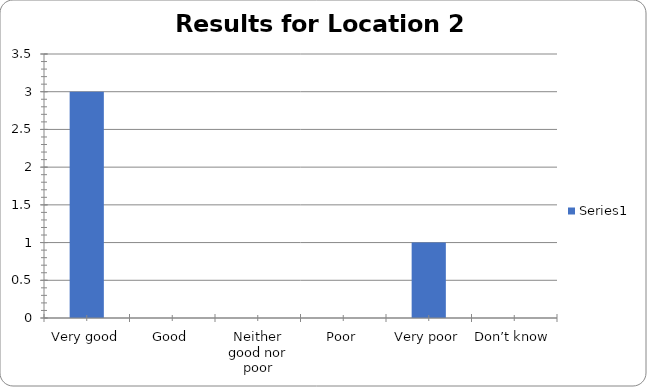
| Category | Series 0 |
|---|---|
| Very good | 3 |
| Good | 0 |
| Neither good nor poor | 0 |
| Poor | 0 |
| Very poor | 1 |
| Don’t know | 0 |